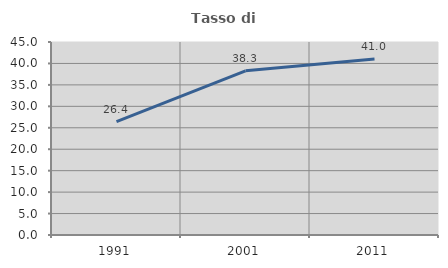
| Category | Tasso di occupazione   |
|---|---|
| 1991.0 | 26.444 |
| 2001.0 | 38.278 |
| 2011.0 | 41.019 |